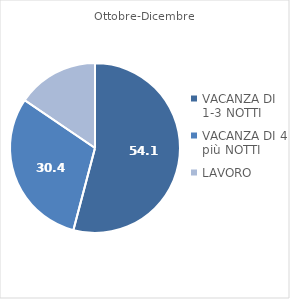
| Category | Series 1 | Series 2 | Series 0 |
|---|---|---|---|
| VACANZA DI 1-3 NOTTI | 54.1 | 56.03 | 56.03 |
| VACANZA DI 4 o più NOTTI | 30.4 | 29.431 | 29.431 |
| LAVORO | 15.5 | 14.539 | 14.539 |